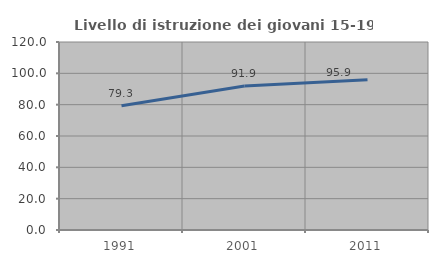
| Category | Livello di istruzione dei giovani 15-19 anni |
|---|---|
| 1991.0 | 79.292 |
| 2001.0 | 91.867 |
| 2011.0 | 95.931 |